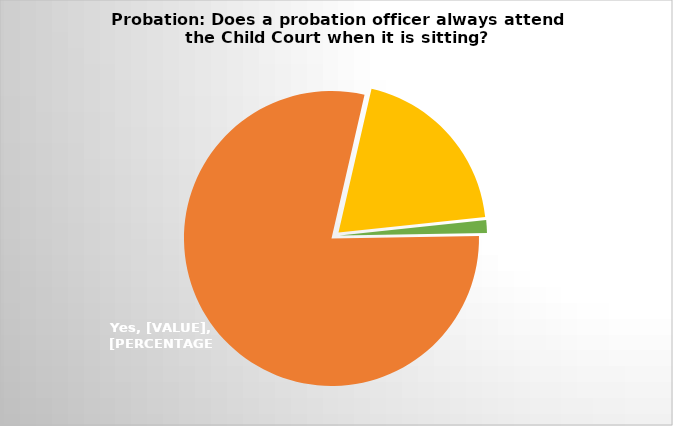
| Category | Series 1 | Series 0 |
|---|---|---|
| 0 | 56 | 48 |
| 1 | 14 | 183 |
| 2 | 1 | 6 |